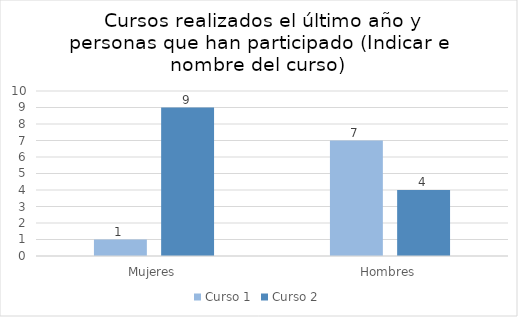
| Category | Curso 1 | Curso 2 |
|---|---|---|
| Mujeres | 1 | 9 |
| Hombres | 7 | 4 |